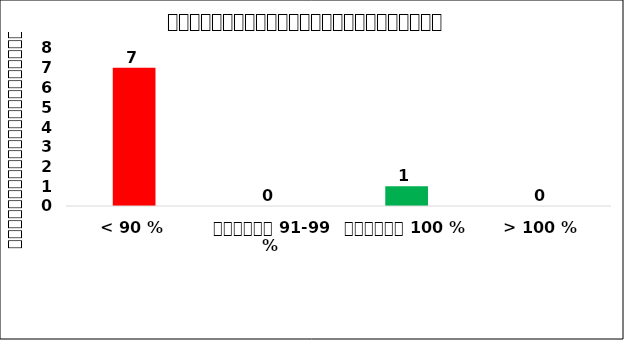
| Category | Number of OD |
|---|---|
| < 90 % | 7 |
| ចន្លោះ 91-99 % | 0 |
| ពេញលេញ 100 % | 1 |
| > 100 % | 0 |